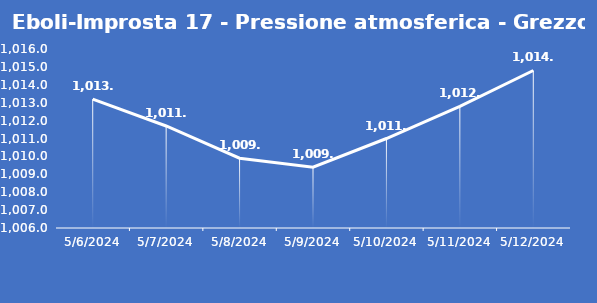
| Category | Eboli-Improsta 17 - Pressione atmosferica - Grezzo (hPa) |
|---|---|
| 5/6/24 | 1013.2 |
| 5/7/24 | 1011.7 |
| 5/8/24 | 1009.9 |
| 5/9/24 | 1009.4 |
| 5/10/24 | 1011 |
| 5/11/24 | 1012.8 |
| 5/12/24 | 1014.8 |